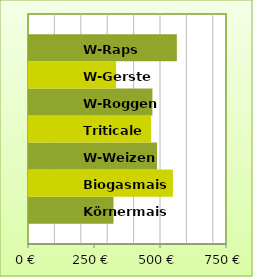
| Category | Körnermais | Biogasmais | W-Weizen | Triticale | W-Roggen | W-Gerste | W-Raps |
|---|---|---|---|---|---|---|---|
| 0 | 320 | 545 | 485 | 462.5 | 467.5 | 330 | 560 |